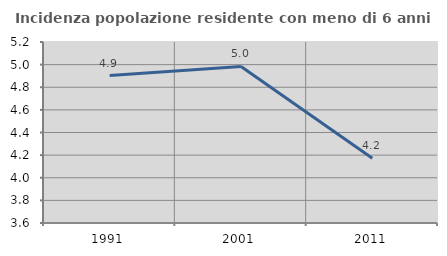
| Category | Incidenza popolazione residente con meno di 6 anni |
|---|---|
| 1991.0 | 4.904 |
| 2001.0 | 4.984 |
| 2011.0 | 4.171 |